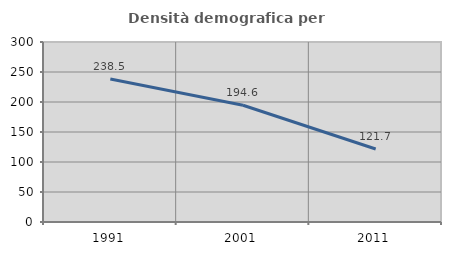
| Category | Densità demografica |
|---|---|
| 1991.0 | 238.48 |
| 2001.0 | 194.597 |
| 2011.0 | 121.678 |